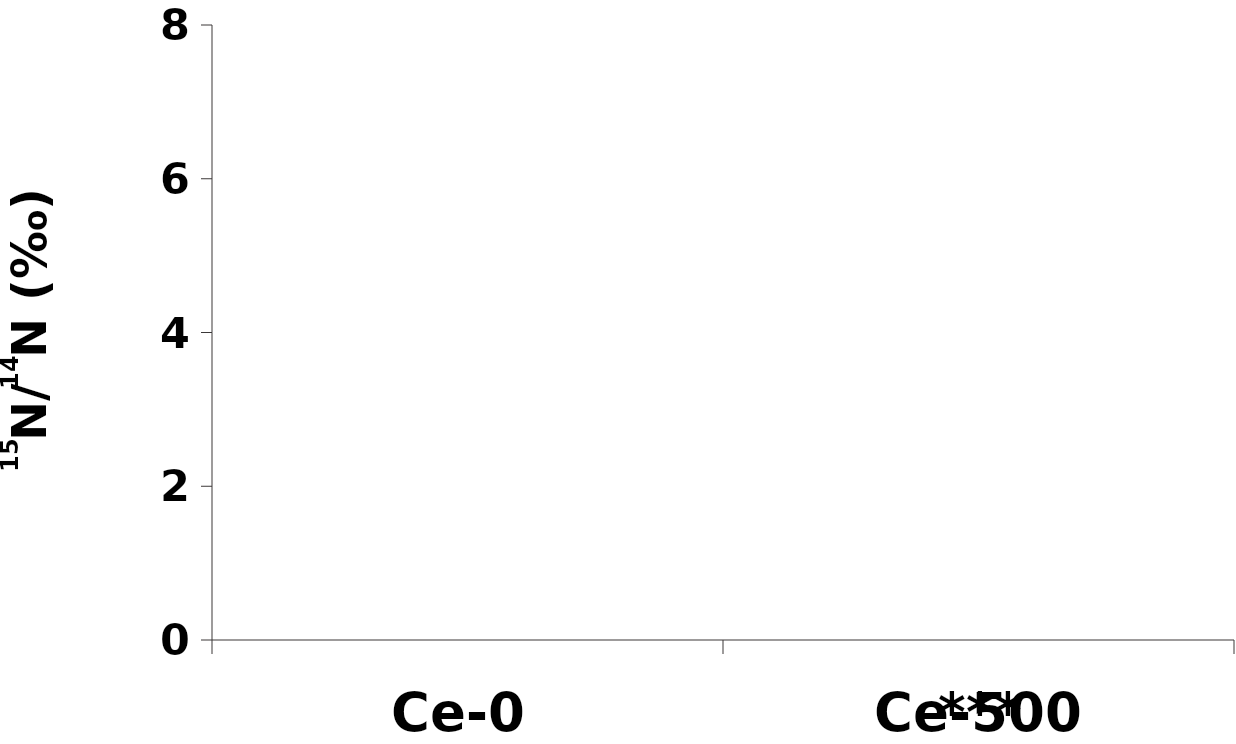
| Category | δ15N |
|---|---|
| Ce-0 | -3.116 |
| Ce-500 | -2.629 |